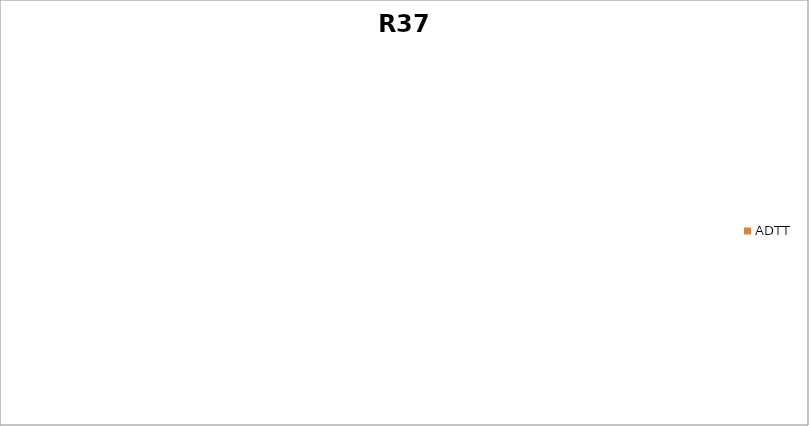
| Category | ADTT |
|---|---|
| T27(Between R536 and R539) | 208.72 |
| T26(Between Lydenburg and R537 Sabie T/O) | 171.942 |
| T25(Between Lydenburg & Burgersfort) | 234.047 |
| SFC Burgersfort Sout(Between Burgersfort and Lydenburg) | 232.49 |
| SFC Burgsersfort Eas(Between Burgersfort and Leeuwvallei) | 901.645 |
| SFC Derde Gelid(Between Burgersfort and Derde Gelid) | 639.038 |
| SFC Makgemeng(Between Makgemeng and R037) | 511.444 |
| SFC Driekop South(Between Driekop and Derde Gelid) | 713.575 |
| SFC Driekop North(Between Lebowakgomo and Driekop) | 620.1 |
| S24(Between R518 and R555) | 307.563 |
| T23(Between R518 and R579) | 259.163 |
| R37 Polokwane(Between Lebowakgomo & Polokwane) | 673.723 |